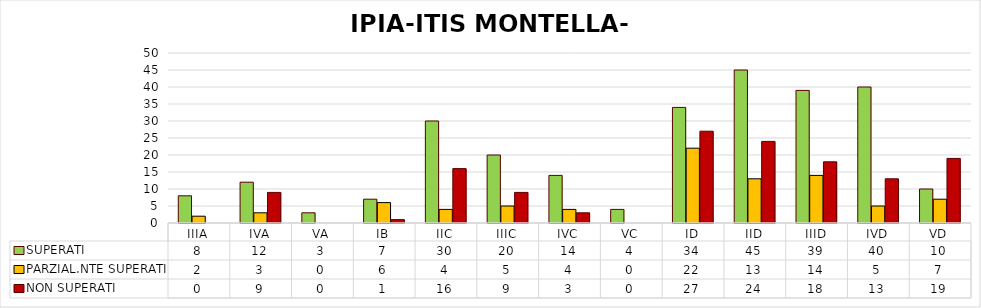
| Category | SUPERATI | PARZIAL.NTE SUPERATI | NON SUPERATI |
|---|---|---|---|
| IIIA | 8 | 2 | 0 |
| IVA | 12 | 3 | 9 |
| VA | 3 | 0 | 0 |
| IB | 7 | 6 | 1 |
| IIC | 30 | 4 | 16 |
| IIIC | 20 | 5 | 9 |
| IVC | 14 | 4 | 3 |
| VC | 4 | 0 | 0 |
| ID | 34 | 22 | 27 |
| IID | 45 | 13 | 24 |
| IIID | 39 | 14 | 18 |
| IVD | 40 | 5 | 13 |
| VD | 10 | 7 | 19 |